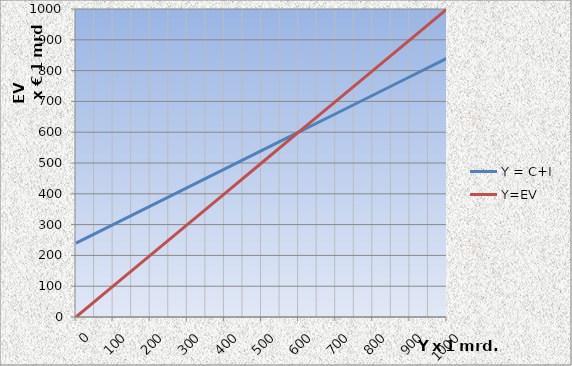
| Category | Y = C+I | Y=EV |
|---|---|---|
| 0.0 | 240 | 0 |
| 100.0 | 300 | 100 |
| 200.0 | 360 | 200 |
| 300.0 | 420 | 300 |
| 400.0 | 480 | 400 |
| 500.0 | 540 | 500 |
| 600.0 | 600 | 600 |
| 700.0 | 660 | 700 |
| 800.0 | 720 | 800 |
| 900.0 | 780 | 900 |
| 1000.0 | 840 | 1000 |